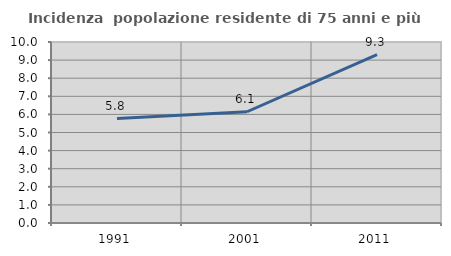
| Category | Incidenza  popolazione residente di 75 anni e più |
|---|---|
| 1991.0 | 5.773 |
| 2001.0 | 6.146 |
| 2011.0 | 9.296 |